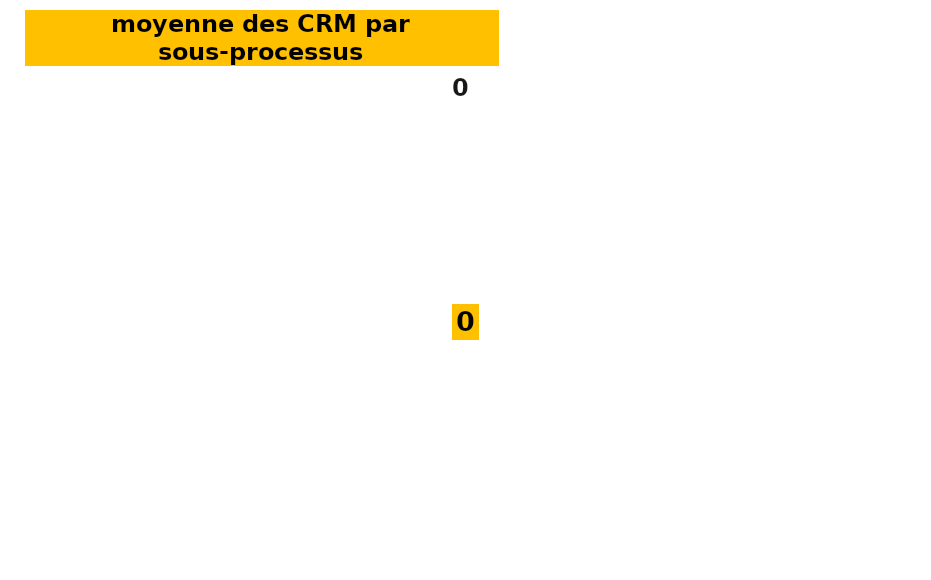
| Category | CR Maitrise | Series 1 | Series 2 | Series 3 |
|---|---|---|---|---|
| 0.0 | 0 | 6 | 13 | 25 |